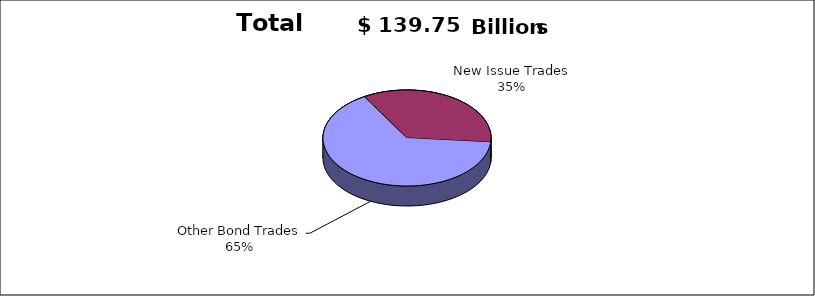
| Category | Series 0 |
|---|---|
| Other Bond Trades | 91033374562 |
| New Issue Trades | 48718155858 |